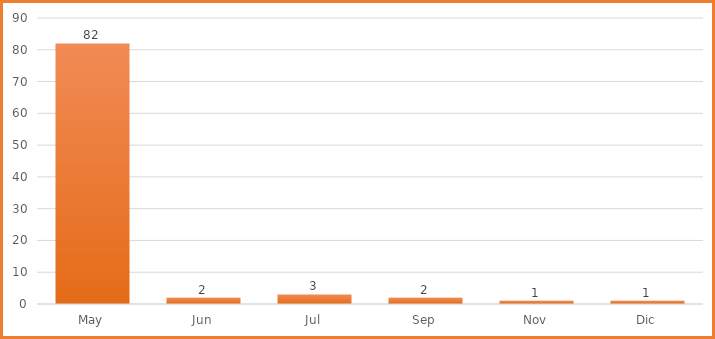
| Category | Total |
|---|---|
| May | 82 |
| Jun | 2 |
| Jul | 3 |
| Sep | 2 |
| Nov | 1 |
| Dic | 1 |